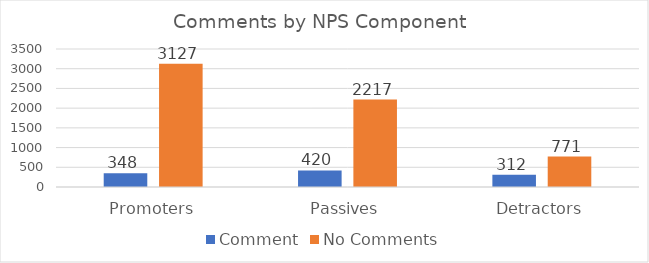
| Category | Comment | No Comments |
|---|---|---|
| Promoters | 348 | 3126.98 |
| Passives | 420 | 2217.07 |
| Detractors | 312 | 770.95 |